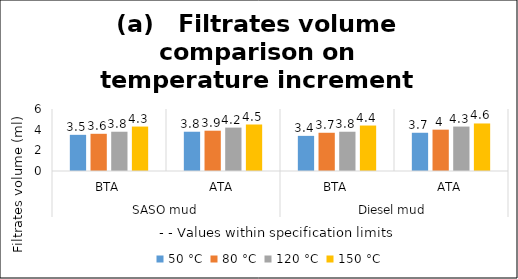
| Category | 50 °C | 80 °C | 120 °C | 150 °C |
|---|---|---|---|---|
| 0 | 3.5 | 3.6 | 3.8 | 4.3 |
| 1 | 3.8 | 3.9 | 4.2 | 4.5 |
| 2 | 3.4 | 3.7 | 3.8 | 4.4 |
| 3 | 3.7 | 4 | 4.3 | 4.6 |